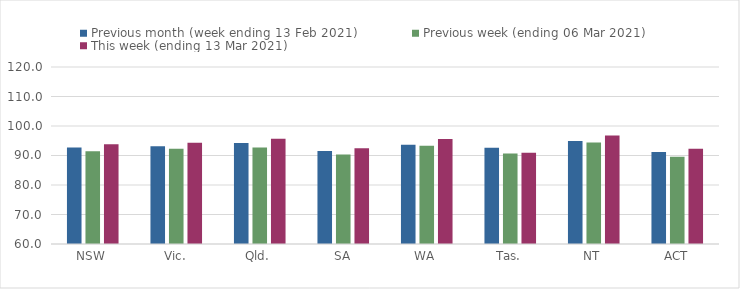
| Category | Previous month (week ending 13 Feb 2021) | Previous week (ending 06 Mar 2021) | This week (ending 13 Mar 2021) |
|---|---|---|---|
| NSW | 92.74 | 91.45 | 93.82 |
| Vic. | 93.17 | 92.25 | 94.32 |
| Qld. | 94.22 | 92.69 | 95.68 |
| SA | 91.51 | 90.31 | 92.44 |
| WA | 93.66 | 93.31 | 95.58 |
| Tas. | 92.61 | 90.66 | 90.9 |
| NT | 94.91 | 94.41 | 96.82 |
| ACT | 91.17 | 89.59 | 92.27 |